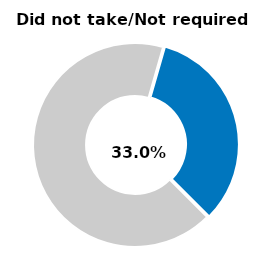
| Category | Series 0 |
|---|---|
| Did not take/not required | 0.33 |
| Other | 0.67 |